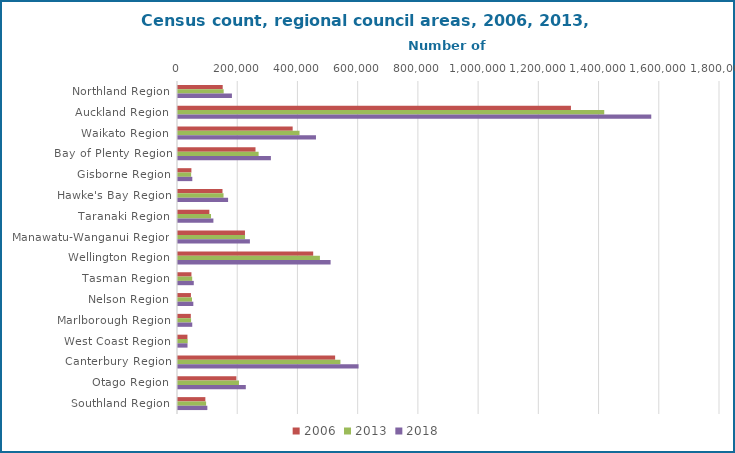
| Category | 2001 | 2006 | 2013 | 2018 |
|---|---|---|---|---|
| Northland Region |  | 148470 | 151689 | 179076 |
| Auckland Region |  | 1304961 | 1415550 | 1571718 |
| Waikato Region |  | 380823 | 403638 | 458202 |
| Bay of Plenty Region |  | 257379 | 267741 | 308499 |
| Gisborne Region |  | 44496 | 43653 | 47517 |
| Hawke's Bay Region |  | 147783 | 151179 | 166368 |
| Taranaki Region |  | 104124 | 109608 | 117561 |
| Manawatu-Wanganui Region |  | 222423 | 222669 | 238797 |
| Wellington Region |  | 448959 | 471315 | 506814 |
| Tasman Region |  | 44625 | 47157 | 52389 |
| Nelson Region |  | 42888 | 46437 | 50880 |
| Marlborough Region |  | 42558 | 43416 | 47340 |
| West Coast Region |  | 31326 | 32148 | 31575 |
| Canterbury Region |  | 521832 | 539433 | 599694 |
| Otago Region |  | 193803 | 202470 | 225186 |
| Southland Region |  | 90876 | 93339 | 97467 |